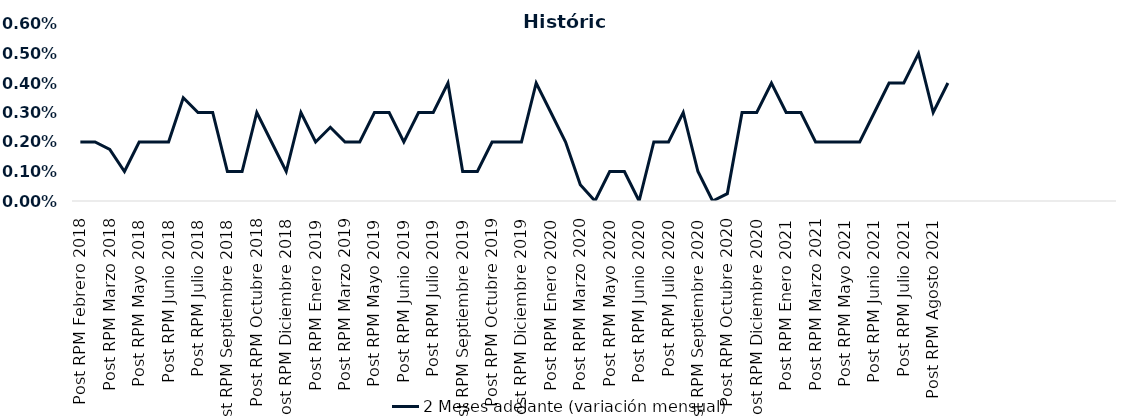
| Category | 2 Meses adelante (variación mensual) |
|---|---|
| Post RPM Febrero 2018 | 0.002 |
| Pre RPM Marzo 2018 | 0.002 |
| Post RPM Marzo 2018 | 0.002 |
| Pre RPM Mayo 2018 | 0.001 |
| Post RPM Mayo 2018 | 0.002 |
| Pre RPM Junio 2018 | 0.002 |
| Post RPM Junio 2018 | 0.002 |
| Pre RPM Julio 2018 | 0.004 |
| Post RPM Julio 2018 | 0.003 |
| Pre RPM Septiembre 2018 | 0.003 |
| Post RPM Septiembre 2018 | 0.001 |
| Pre RPM Octubre 2018 | 0.001 |
| Post RPM Octubre 2018 | 0.003 |
| Pre RPM Diciembre 2018 | 0.002 |
| Post RPM Diciembre 2018 | 0.001 |
| Pre RPM Enero 2019 | 0.003 |
| Post RPM Enero 2019 | 0.002 |
| Pre RPM Marzo 2019 | 0.002 |
| Post RPM Marzo 2019 | 0.002 |
| Pre RPM Mayo 2019 | 0.002 |
| Post RPM Mayo 2019 | 0.003 |
| Pre RPM Junio 2019 | 0.003 |
| Post RPM Junio 2019 | 0.002 |
| Pre RPM Julio 2019 | 0.003 |
| Post RPM Julio 2019 | 0.003 |
| Pre RPM Septiembre 2019 | 0.004 |
| Post RPM Septiembre 2019 | 0.001 |
| Pre RPM Octubre 2019 | 0.001 |
| Post RPM Octubre 2019 | 0.002 |
| Pre RPM Diciembre 2019 | 0.002 |
| Post RPM Diciembre 2019 | 0.002 |
| Pre RPM Enero 2020 | 0.004 |
| Post RPM Enero 2020 | 0.003 |
| Pre RPM Marzo 2020 | 0.002 |
| Post RPM Marzo 2020 | 0.001 |
| Pre RPM Mayo 2020 | 0 |
| Post RPM Mayo 2020 | 0.001 |
| Pre RPM Junio 2020 | 0.001 |
| Post RPM Junio 2020 | 0 |
| Pre RPM Julio 2020 | 0.002 |
| Post RPM Julio 2020 | 0.002 |
| Pre RPM Septiembre 2020 | 0.003 |
| Post RPM Septiembre 2020 | 0.001 |
| Pre RPM Octubre 2020 | 0 |
| Post RPM Octubre 2020 | 0 |
| Pre RPM Diciembre 2020 | 0.003 |
| Post RPM Diciembre 2020 | 0.003 |
| Pre RPM Enero 2021 | 0.004 |
| Post RPM Enero 2021 | 0.003 |
| Pre RPM Marzo 2021 | 0.003 |
| Post RPM Marzo 2021 | 0.002 |
| Pre RPM Mayo 2021 | 0.002 |
| Post RPM Mayo 2021 | 0.002 |
| Pre RPM Junio 2021 | 0.002 |
| Post RPM Junio 2021 | 0.003 |
| Pre RPM Julio 2021 | 0.004 |
| Post RPM Julio 2021 | 0.004 |
| Pre RPM Agosto 2021 | 0.005 |
| Post RPM Agosto 2021 | 0.003 |
| Pre RPM Octubre 2021 | 0.004 |